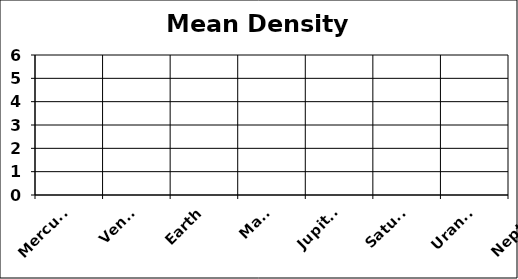
| Category | Mean Density (g/mL) |
|---|---|
| Mercury | 5.43 |
| Venus | 5.25 |
| Earth | 5.52 |
| Mars | 3.93 |
| Jupiter | 1.33 |
| Saturn | 0.71 |
| Uranus | 1.24 |
| Neptune | 1.67 |